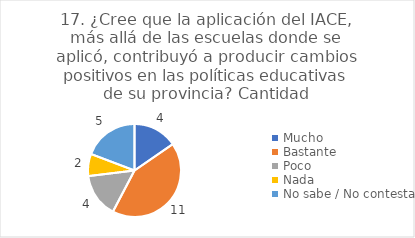
| Category | 17. ¿Cree que la aplicación del IACE, más allá de las escuelas donde se aplicó, contribuyó a producir cambios positivos en las políticas educativas de su provincia? |
|---|---|
| Mucho  | 0.154 |
| Bastante  | 0.423 |
| Poco  | 0.154 |
| Nada  | 0.077 |
| No sabe / No contesta | 0.192 |